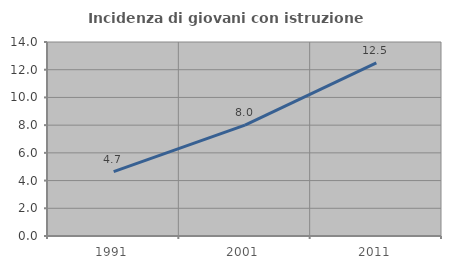
| Category | Incidenza di giovani con istruzione universitaria |
|---|---|
| 1991.0 | 4.651 |
| 2001.0 | 8 |
| 2011.0 | 12.5 |